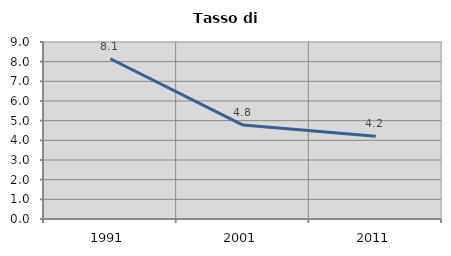
| Category | Tasso di disoccupazione   |
|---|---|
| 1991.0 | 8.148 |
| 2001.0 | 4.774 |
| 2011.0 | 4.204 |